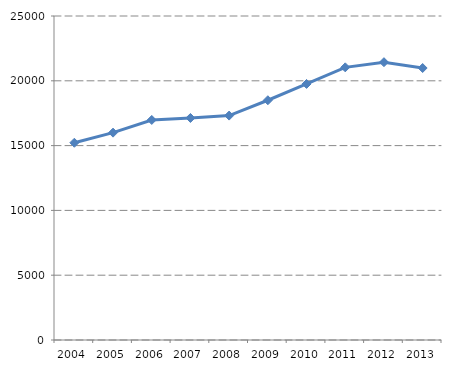
| Category | Bénéficiaires |
|---|---|
| 2004.0 | 15218.928 |
| 2005.0 | 15999.562 |
| 2006.0 | 16978.529 |
| 2007.0 | 17132.971 |
| 2008.0 | 17315.758 |
| 2009.0 | 18500.13 |
| 2010.0 | 19756.842 |
| 2011.0 | 21038.704 |
| 2012.0 | 21435.825 |
| 2013.0 | 20985.948 |